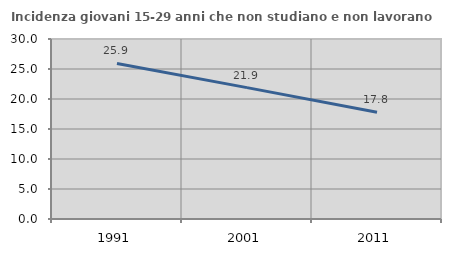
| Category | Incidenza giovani 15-29 anni che non studiano e non lavorano  |
|---|---|
| 1991.0 | 25.926 |
| 2001.0 | 21.895 |
| 2011.0 | 17.788 |